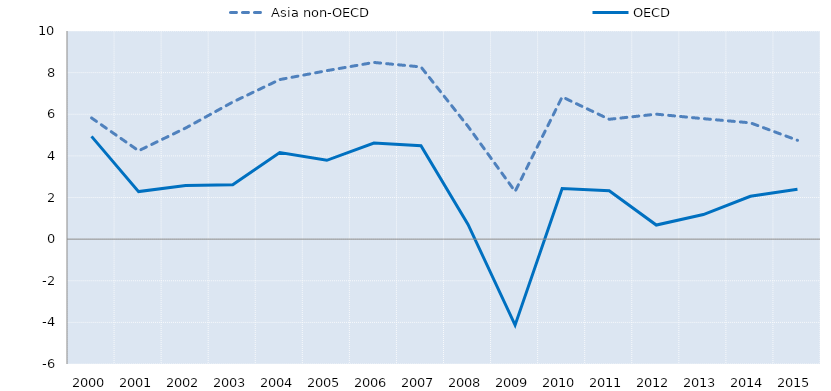
| Category | Asia non-OECD | OECD |
|---|---|---|
| 2000.0 | 5.823 | 4.937 |
| 2001.0 | 4.246 | 2.283 |
| 2002.0 | 5.338 | 2.582 |
| 2003.0 | 6.586 | 2.61 |
| 2004.0 | 7.666 | 4.156 |
| 2005.0 | 8.095 | 3.787 |
| 2006.0 | 8.49 | 4.619 |
| 2007.0 | 8.273 | 4.491 |
| 2008.0 | 5.416 | 0.707 |
| 2009.0 | 2.293 | -4.132 |
| 2010.0 | 6.833 | 2.432 |
| 2011.0 | 5.758 | 2.328 |
| 2012.0 | 6.004 | 0.677 |
| 2013.0 | 5.787 | 1.18 |
| 2014.0 | 5.588 | 2.059 |
| 2015.0 | 4.748 | 2.395 |